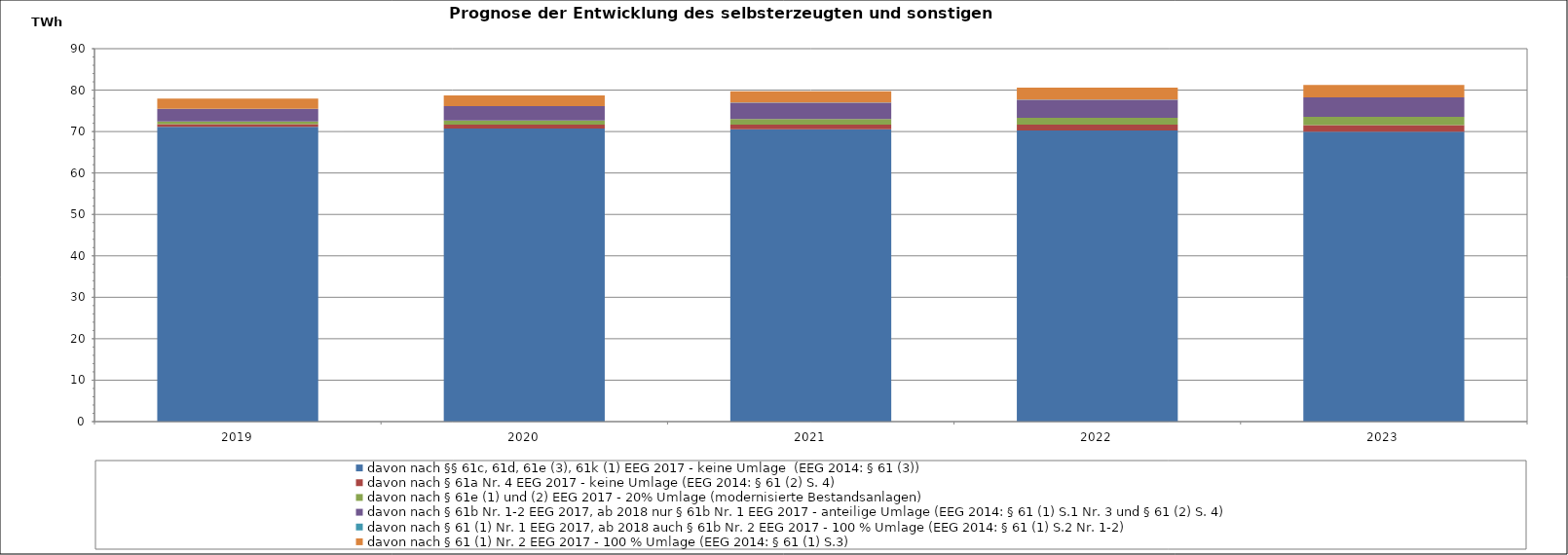
| Category |  davon nach §§ 61c, 61d, 61e (3), 61k (1) EEG 2017 - keine Umlage  (EEG 2014: § 61 (3))  |  davon nach § 61a Nr. 4 EEG 2017 - keine Umlage (EEG 2014: § 61 (2) S. 4)  |  davon nach § 61e (1) und (2) EEG 2017 - 20% Umlage (modernisierte Bestandsanlagen)  |  davon nach § 61b Nr. 1-2 EEG 2017, ab 2018 nur § 61b Nr. 1 EEG 2017 - anteilige Umlage (EEG 2014: § 61 (1) S.1 Nr. 3 und § 61 (2) S. 4)  |  davon nach § 61 (1) Nr. 1 EEG 2017, ab 2018 auch § 61b Nr. 2 EEG 2017 - 100 % Umlage (EEG 2014: § 61 (1) S.2 Nr. 1-2)  |  davon nach § 61 (1) Nr. 2 EEG 2017 - 100 % Umlage (EEG 2014: § 61 (1) S.3)  |
|---|---|---|---|---|---|---|
| 2019.0 | 71.135 | 0.648 | 0.678 | 2.984 | 0.047 | 2.463 |
| 2020.0 | 70.746 | 0.904 | 1.013 | 3.446 | 0.05 | 2.587 |
| 2021.0 | 70.53 | 1.169 | 1.345 | 3.916 | 0.052 | 2.716 |
| 2022.0 | 70.265 | 1.4 | 1.674 | 4.336 | 0.055 | 2.852 |
| 2023.0 | 69.953 | 1.581 | 2.002 | 4.686 | 0.058 | 2.994 |